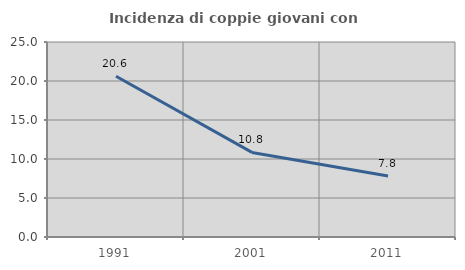
| Category | Incidenza di coppie giovani con figli |
|---|---|
| 1991.0 | 20.612 |
| 2001.0 | 10.843 |
| 2011.0 | 7.825 |